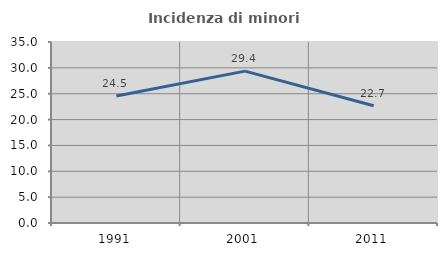
| Category | Incidenza di minori stranieri |
|---|---|
| 1991.0 | 24.545 |
| 2001.0 | 29.371 |
| 2011.0 | 22.67 |